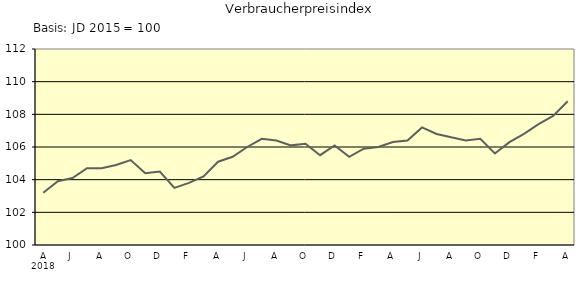
| Category | Series 0 |
|---|---|
| 0 | 103.2 |
| 1 | 103.9 |
| 2 | 104.1 |
| 3 | 104.7 |
| 4 | 104.7 |
| 5 | 104.9 |
| 6 | 105.2 |
| 7 | 104.4 |
| 8 | 104.5 |
| 9 | 103.5 |
| 10 | 103.8 |
| 11 | 104.2 |
| 12 | 105.1 |
| 13 | 105.4 |
| 14 | 106 |
| 15 | 106.5 |
| 16 | 106.4 |
| 17 | 106.1 |
| 18 | 106.2 |
| 19 | 105.5 |
| 20 | 106.1 |
| 21 | 105.4 |
| 22 | 105.9 |
| 23 | 106 |
| 24 | 106.3 |
| 25 | 106.4 |
| 26 | 107.2 |
| 27 | 106.8 |
| 28 | 106.6 |
| 29 | 106.4 |
| 30 | 106.5 |
| 31 | 105.6 |
| 32 | 106.3 |
| 33 | 106.8 |
| 34 | 107.4 |
| 35 | 107.9 |
| 36 | 108.8 |